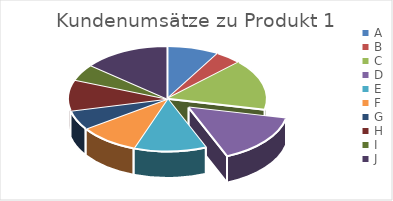
| Category | Produkt 1 |
|---|---|
| A | 23876 |
| B | 12056 |
| C | 43776 |
| D | 43120 |
| E | 33219 |
| F | 27654 |
| G | 16901 |
| H | 26754 |
| I | 14321 |
| J | 39453 |